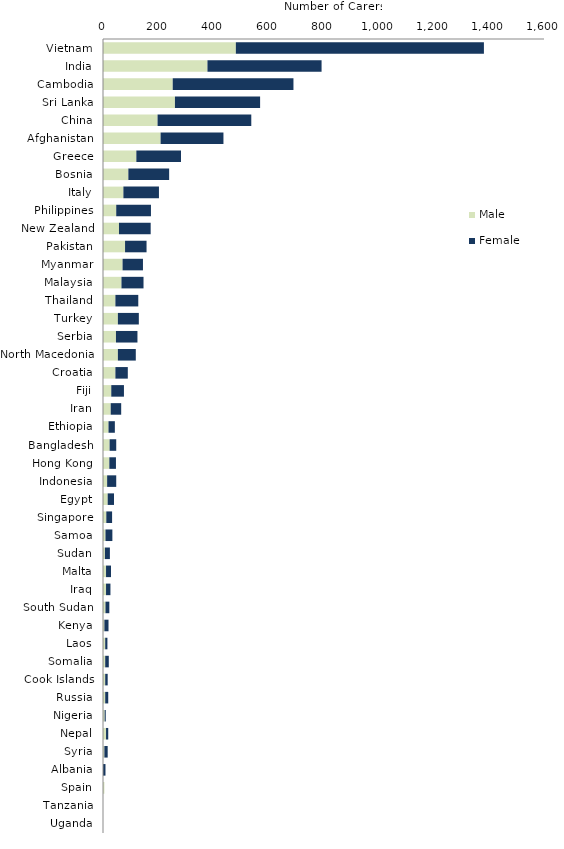
| Category | Male | Female |
|---|---|---|
| Vietnam | 482 | 900 |
| India | 379 | 414 |
| Cambodia | 253 | 438 |
| Sri Lanka | 261 | 309 |
| China | 198 | 340 |
| Afghanistan | 209 | 228 |
| Greece | 121 | 162 |
| Bosnia | 92 | 148 |
| Italy | 74 | 129 |
| Philippines | 48 | 126 |
| New Zealand | 58 | 115 |
| Pakistan | 80 | 78 |
| Myanmar | 71 | 74 |
| Malaysia | 67 | 80 |
| Thailand | 45 | 83 |
| Turkey | 54 | 76 |
| Serbia | 47 | 78 |
| North Macedonia | 54 | 65 |
| Croatia | 45 | 45 |
| Fiji | 30 | 46 |
| Iran | 28 | 38 |
| Ethiopia | 20 | 23 |
| Bangladesh | 24 | 24 |
| Hong Kong | 23 | 24 |
| Indonesia | 15 | 33 |
| Egypt | 17 | 23 |
| Singapore | 12 | 21 |
| Samoa | 9 | 25 |
| Sudan | 7 | 18 |
| Malta | 11 | 18 |
| Iraq | 11 | 16 |
| South Sudan | 9 | 14 |
| Kenya | 5 | 15 |
| Laos | 8 | 8 |
| Somalia | 8 | 13 |
| Cook Islands | 8 | 9 |
| Russia | 8 | 11 |
| Nigeria | 6 | 4 |
| Nepal | 11 | 8 |
| Syria | 5 | 12 |
| Albania | 0 | 9 |
| Spain | 5 | 0 |
| Tanzania | 0 | 0 |
| Uganda | 0 | 0 |